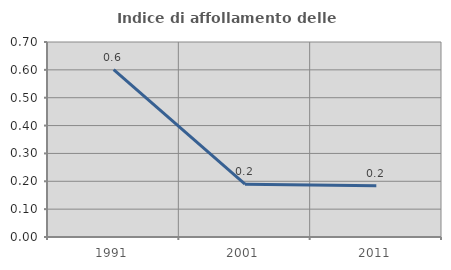
| Category | Indice di affollamento delle abitazioni  |
|---|---|
| 1991.0 | 0.601 |
| 2001.0 | 0.189 |
| 2011.0 | 0.184 |